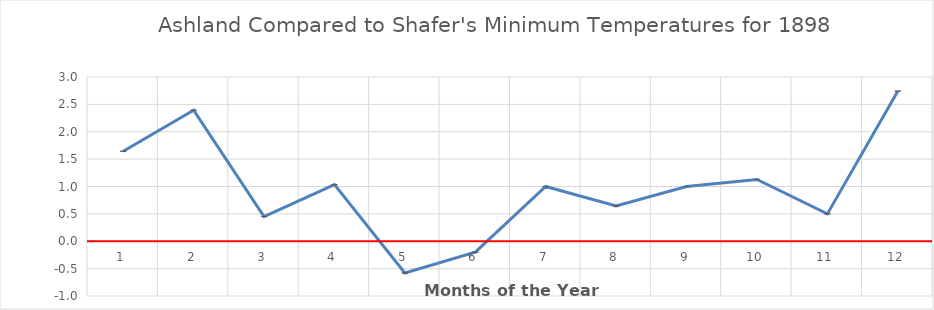
| Category | Series 0 |
|---|---|
| 0 | 1.645 |
| 1 | 2.393 |
| 2 | 0.452 |
| 3 | 1.033 |
| 4 | -0.581 |
| 5 | -0.2 |
| 6 | 1 |
| 7 | 0.645 |
| 8 | 1 |
| 9 | 1.129 |
| 10 | 0.5 |
| 11 | 2.742 |